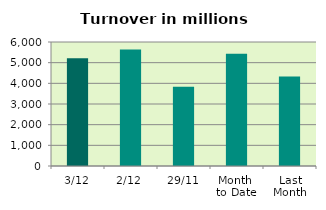
| Category | Series 0 |
|---|---|
| 3/12 | 5218.606 |
| 2/12 | 5637.772 |
| 29/11 | 3839.534 |
| Month 
to Date | 5428.189 |
| Last
Month | 4332.538 |